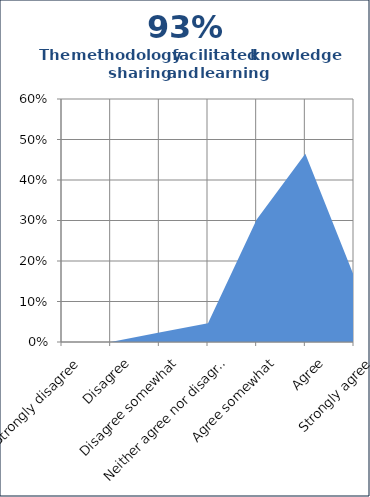
| Category | Series 1 |
|---|---|
| Strongly disagree | 0 |
| Disagree | 0 |
| Disagree somewhat | 0.023 |
| Neither agree nor disagree | 0.047 |
| Agree somewhat | 0.302 |
| Agree | 0.465 |
| Strongly agree | 0.163 |